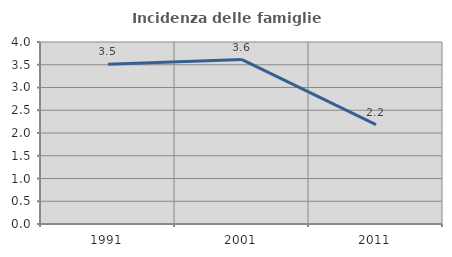
| Category | Incidenza delle famiglie numerose |
|---|---|
| 1991.0 | 3.509 |
| 2001.0 | 3.613 |
| 2011.0 | 2.185 |